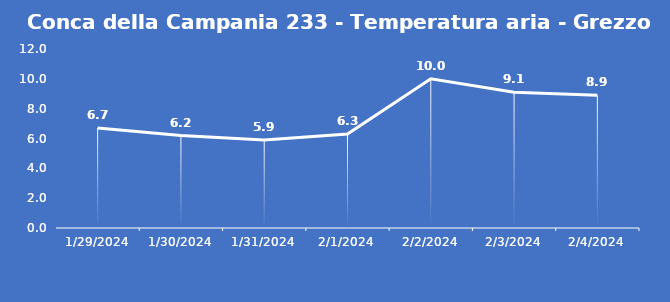
| Category | Conca della Campania 233 - Temperatura aria - Grezzo (°C) |
|---|---|
| 1/29/24 | 6.7 |
| 1/30/24 | 6.2 |
| 1/31/24 | 5.9 |
| 2/1/24 | 6.3 |
| 2/2/24 | 10 |
| 2/3/24 | 9.1 |
| 2/4/24 | 8.9 |